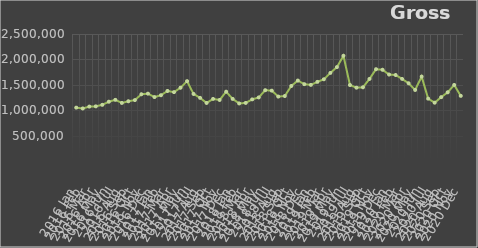
| Category | Total |
|---|---|
| 0 | 1050782.052 |
| 1 | 1033965.026 |
| 2 | 1071173.05 |
| 3 | 1075802.451 |
| 4 | 1105936.567 |
| 5 | 1166916.33 |
| 6 | 1204022.171 |
| 7 | 1143087.648 |
| 8 | 1175999.487 |
| 9 | 1199301.381 |
| 10 | 1313869.337 |
| 11 | 1325904.09 |
| 12 | 1258541.189 |
| 13 | 1294997.541 |
| 14 | 1378587.247 |
| 15 | 1356132.341 |
| 16 | 1442596.749 |
| 17 | 1571848.338 |
| 18 | 1319962.039 |
| 19 | 1243218.309 |
| 20 | 1142612.182 |
| 21 | 1222403.758 |
| 22 | 1201557.574 |
| 23 | 1364454.119 |
| 24 | 1222622.051 |
| 25 | 1133088.602 |
| 26 | 1143247.392 |
| 27 | 1213297.242 |
| 28 | 1251261.429 |
| 29 | 1393705.437 |
| 30 | 1385693.019 |
| 31 | 1268125.752 |
| 32 | 1278895.937 |
| 33 | 1477286.733 |
| 34 | 1583413.942 |
| 35 | 1512544.306 |
| 36 | 1497932.002 |
| 37 | 1557628.269 |
| 38 | 1608765.204 |
| 39 | 1734433.324 |
| 40 | 1848282.411 |
| 41 | 2070508.09 |
| 42 | 1495648.601 |
| 43 | 1443304.488 |
| 44 | 1451257.972 |
| 45 | 1615926.051 |
| 46 | 1806980.06 |
| 47 | 1795701.637 |
| 48 | 1702192.161 |
| 49 | 1692776.351 |
| 50 | 1616019.518 |
| 51 | 1529710.129 |
| 52 | 1398828.508 |
| 53 | 1661430.428 |
| 54 | 1227736.494 |
| 55 | 1148218.018 |
| 56 | 1256790.35 |
| 57 | 1352744.129 |
| 58 | 1497067.922 |
| 59 | 1281677.218 |